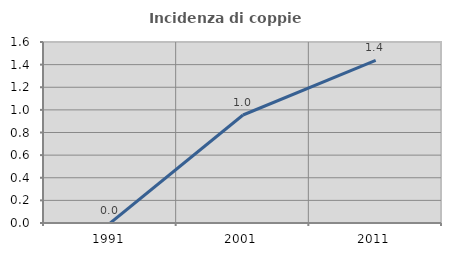
| Category | Incidenza di coppie miste |
|---|---|
| 1991.0 | 0 |
| 2001.0 | 0.955 |
| 2011.0 | 1.437 |